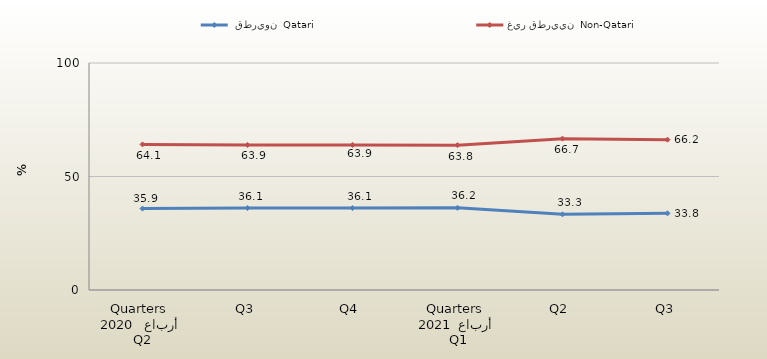
| Category |  قطريون  Qatari | غير قطريين  Non-Qatari |
|---|---|---|
| 0 | 35.862 | 64.138 |
| 1 | 36.111 | 63.889 |
| 2 | 36.111 | 63.889 |
| 3 | 36.207 | 63.793 |
| 4 | 33.333 | 66.667 |
| 5 | 33.784 | 66.216 |